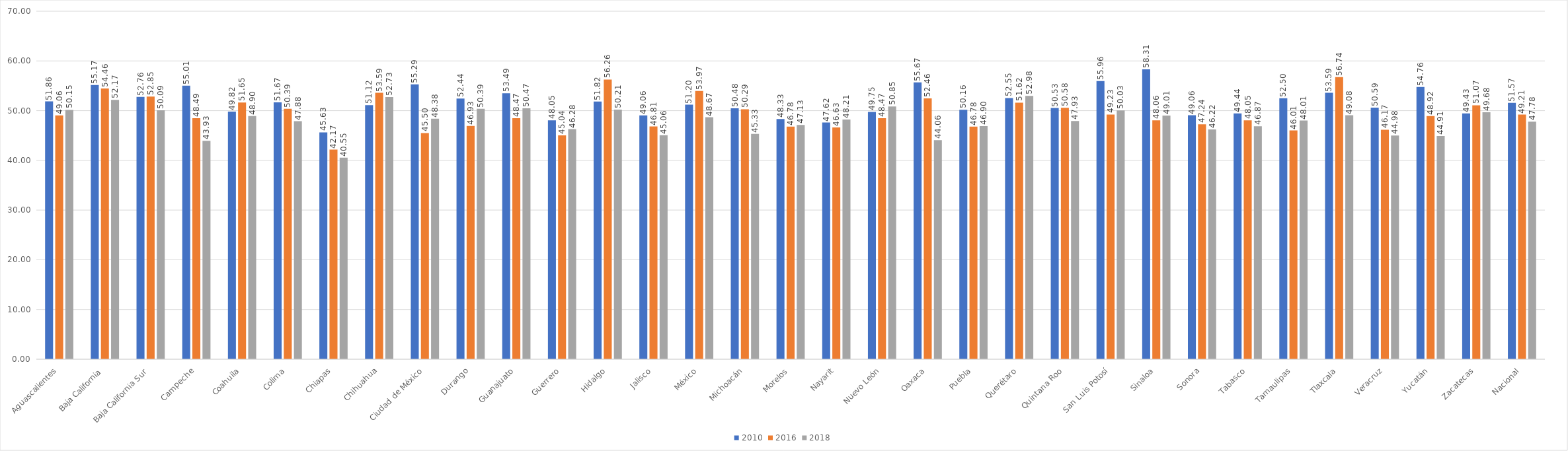
| Category | 2010 | 2016 | 2018 |
|---|---|---|---|
| Aguascalientes | 51.864 | 49.061 | 50.153 |
| Baja California | 55.168 | 54.462 | 52.17 |
| Baja California Sur | 52.759 | 52.847 | 50.086 |
| Campeche | 55.012 | 48.492 | 43.927 |
| Coahuila | 49.816 | 51.645 | 48.901 |
| Colima | 51.673 | 50.391 | 47.877 |
| Chiapas | 45.632 | 42.169 | 40.549 |
| Chihuahua | 51.121 | 53.59 | 52.726 |
| Ciudad de México | 55.295 | 45.497 | 48.379 |
| Durango | 52.444 | 46.925 | 50.391 |
| Guanajuato | 53.494 | 48.474 | 50.467 |
| Guerrero | 48.05 | 45.04 | 46.276 |
| Hidalgo | 51.825 | 56.264 | 50.212 |
| Jalisco | 49.061 | 46.806 | 45.065 |
| México | 51.202 | 53.969 | 48.666 |
| Michoacán | 50.476 | 50.287 | 45.328 |
| Morelos | 48.331 | 46.778 | 47.132 |
| Nayarit | 47.616 | 46.633 | 48.206 |
| Nuevo León | 49.746 | 48.468 | 50.854 |
| Oaxaca | 55.675 | 52.463 | 44.062 |
| Puebla | 50.161 | 46.785 | 46.901 |
| Querétaro | 52.55 | 51.618 | 52.978 |
| Quintana Roo | 50.535 | 50.583 | 47.933 |
| San Luis Potosí | 55.956 | 49.229 | 50.033 |
| Sinaloa | 58.31 | 48.056 | 49.011 |
| Sonora | 49.064 | 47.244 | 46.223 |
| Tabasco | 49.437 | 48.048 | 46.87 |
| Tamaulipas | 52.501 | 46.01 | 48.014 |
| Tlaxcala | 53.59 | 56.742 | 49.078 |
| Veracruz | 50.593 | 46.168 | 44.985 |
| Yucatán | 54.765 | 48.922 | 44.906 |
| Zacatecas | 49.428 | 51.073 | 49.68 |
| Nacional | 51.565 | 49.21 | 47.778 |